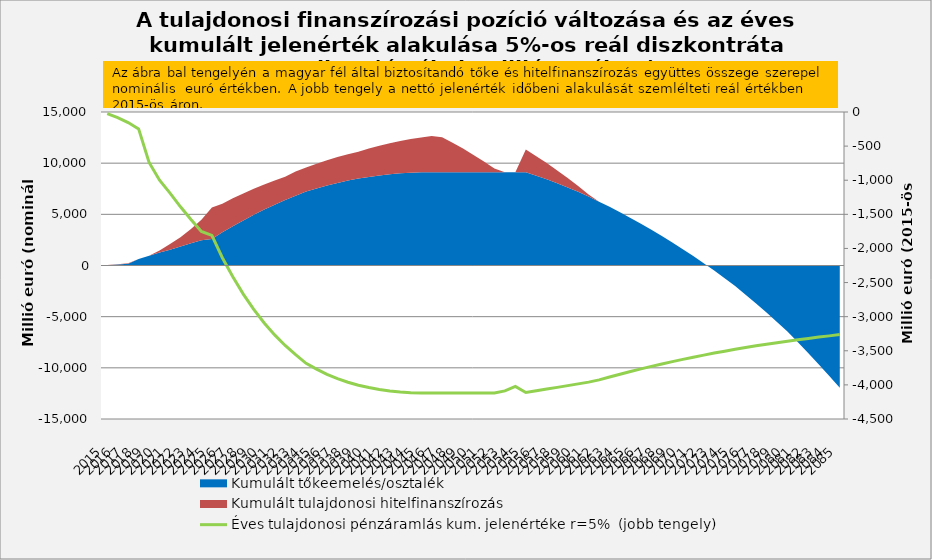
| Category | Éves tulajdonosi pénzáramlás kum. jelenértéke r=5%  (jobb tengely) |
|---|---|
| 2015.0 | -25 |
| 2016.0 | -82.035 |
| 2017.0 | -155.165 |
| 2018.0 | -247.268 |
| 2019.0 | -740.173 |
| 2020.0 | -999.848 |
| 2021.0 | -1188.315 |
| 2022.0 | -1389.41 |
| 2023.0 | -1575.211 |
| 2024.0 | -1751.091 |
| 2025.0 | -1809.691 |
| 2026.0 | -2136.44 |
| 2027.0 | -2415.959 |
| 2028.0 | -2668.745 |
| 2029.0 | -2893.355 |
| 2030.0 | -3092.239 |
| 2031.0 | -3267.656 |
| 2032.0 | -3421.687 |
| 2033.0 | -3556.249 |
| 2034.0 | -3683.302 |
| 2035.0 | -3769.73 |
| 2036.0 | -3845.242 |
| 2037.0 | -3908.833 |
| 2038.0 | -3961.642 |
| 2039.0 | -4004.714 |
| 2040.0 | -4039.006 |
| 2041.0 | -4067.536 |
| 2042.0 | -4089.126 |
| 2043.0 | -4104.49 |
| 2044.0 | -4114.278 |
| 2045.0 | -4119.09 |
| 2046.0 | -4119.471 |
| 2047.0 | -4119.471 |
| 2048.0 | -4119.471 |
| 2049.0 | -4119.471 |
| 2050.0 | -4119.471 |
| 2051.0 | -4119.471 |
| 2052.0 | -4119.471 |
| 2053.0 | -4087.738 |
| 2054.0 | -4022.059 |
| 2055.0 | -4111.707 |
| 2056.0 | -4086.875 |
| 2057.0 | -4061.689 |
| 2058.0 | -4036.25 |
| 2059.0 | -4010.652 |
| 2060.0 | -3984.979 |
| 2061.0 | -3959.308 |
| 2062.0 | -3926.603 |
| 2063.0 | -3884.122 |
| 2064.0 | -3843.107 |
| 2065.0 | -3803.523 |
| 2066.0 | -3765.334 |
| 2067.0 | -3728.504 |
| 2068.0 | -3692.995 |
| 2069.0 | -3658.772 |
| 2070.0 | -3625.798 |
| 2071.0 | -3594.036 |
| 2072.0 | -3563.451 |
| 2073.0 | -3534.008 |
| 2074.0 | -3505.67 |
| 2075.0 | -3478.404 |
| 2076.0 | -3452.508 |
| 2077.0 | -3427.643 |
| 2078.0 | -3403.772 |
| 2079.0 | -3380.858 |
| 2080.0 | -3358.867 |
| 2081.0 | -3338.228 |
| 2082.0 | -3318.482 |
| 2083.0 | -3299.591 |
| 2084.0 | -3281.519 |
| 2085.0 | -3261.553 |